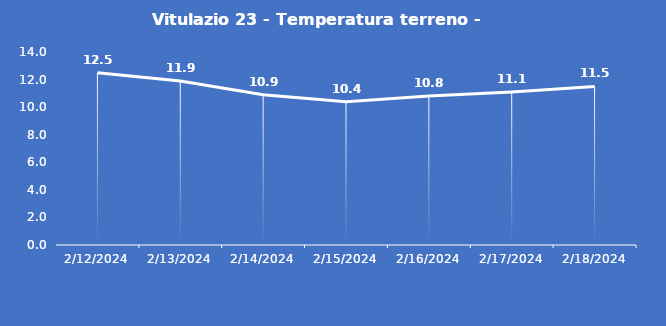
| Category | Vitulazio 23 - Temperatura terreno - Grezzo (°C) |
|---|---|
| 2/12/24 | 12.5 |
| 2/13/24 | 11.9 |
| 2/14/24 | 10.9 |
| 2/15/24 | 10.4 |
| 2/16/24 | 10.8 |
| 2/17/24 | 11.1 |
| 2/18/24 | 11.5 |